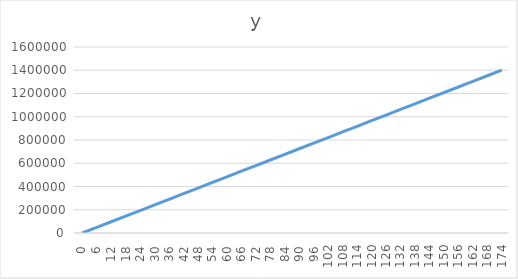
| Category | y |
|---|---|
| 0.0 | 0 |
| 6.0 | 48311.5 |
| 12.0 | 96622.999 |
| 18.0 | 144934.499 |
| 24.0 | 193245.998 |
| 30.0 | 241557.498 |
| 36.0 | 289868.997 |
| 42.0 | 338180.497 |
| 48.0 | 386491.996 |
| 54.0 | 434803.496 |
| 60.0 | 483114.996 |
| 66.0 | 531426.495 |
| 72.0 | 579737.995 |
| 78.0 | 628049.494 |
| 84.0 | 676360.994 |
| 90.0 | 724672.493 |
| 96.0 | 772983.993 |
| 102.0 | 821295.492 |
| 108.0 | 869606.992 |
| 114.0 | 917918.491 |
| 120.0 | 966229.991 |
| 126.0 | 1014541.491 |
| 132.0 | 1062852.99 |
| 138.0 | 1111164.49 |
| 144.0 | 1159475.989 |
| 150.0 | 1207787.489 |
| 156.0 | 1256098.988 |
| 162.0 | 1304410.488 |
| 168.0 | 1352721.987 |
| 174.0 | 1401033.487 |